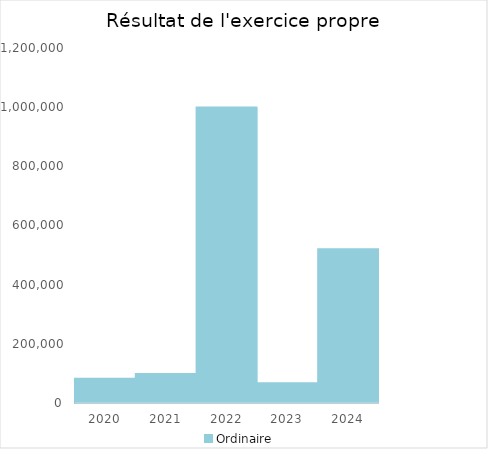
| Category |   | Ordinaire |    |
|---|---|---|---|
| 2020.0 |  | 81598.29 |  |
| 2021.0 |  | 98412.75 |  |
| 2022.0 |  | 998691.5 |  |
| 2023.0 |  | 66451.13 |  |
| 2024.0 |  | 519338.06 |  |